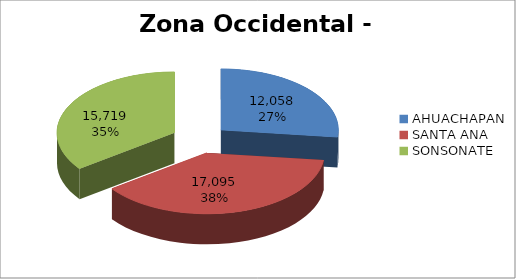
| Category | Series 0 |
|---|---|
| AHUACHAPAN | 12058 |
| SANTA ANA | 17095 |
| SONSONATE | 15719 |